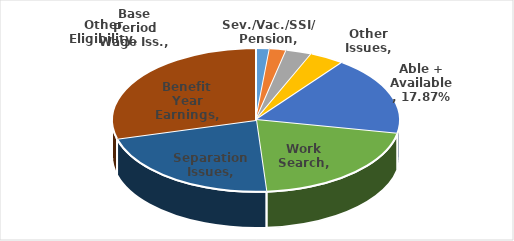
| Category | Series 0 |
|---|---|
| Sev./Vac./SSI/ Pension | 0.015 |
| Other Eligibility | 0.019 |
| Base Period Wage Iss. | 0.029 |
| Other Issues | 0.039 |
| Able + Available | 0.179 |
| Work Search | 0.207 |
| Separation Issues | 0.219 |
| Benefit Year Earnings | 0.292 |